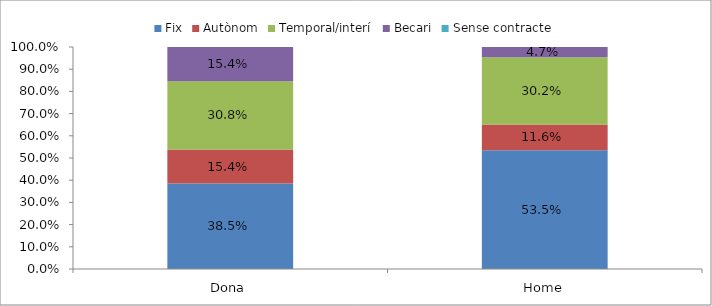
| Category | Fix | Autònom | Temporal/interí | Becari | Sense contracte |
|---|---|---|---|---|---|
| Dona | 0.385 | 0.154 | 0.308 | 0.154 | 0 |
| Home | 0.535 | 0.116 | 0.302 | 0.046 | 0 |